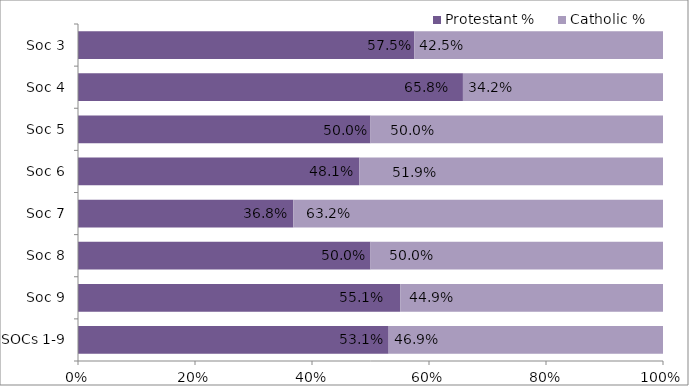
| Category | Protestant | Catholic |
|---|---|---|
| SOCs 1-9 | 0.531 | 0.469 |
| Soc 9 | 0.551 | 0.449 |
| Soc 8 | 0.5 | 0.5 |
| Soc 7 | 0.368 | 0.632 |
| Soc 6 | 0.481 | 0.519 |
| Soc 5 | 0.5 | 0.5 |
| Soc 4 | 0.658 | 0.342 |
| Soc 3 | 0.575 | 0.425 |